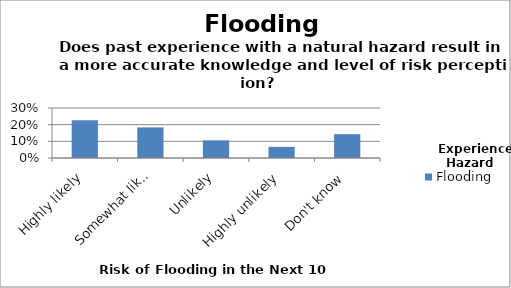
| Category | Flooding |
|---|---|
| Highly likely | 0.227 |
| Somewhat likely | 0.184 |
| Unlikely | 0.106 |
| Highly unlikely | 0.067 |
| Don't know | 0.143 |